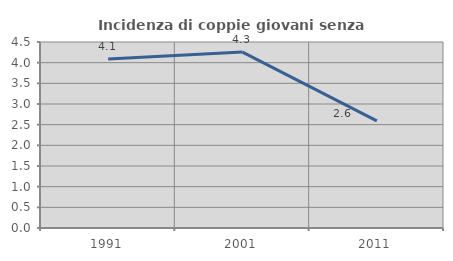
| Category | Incidenza di coppie giovani senza figli |
|---|---|
| 1991.0 | 4.091 |
| 2001.0 | 4.255 |
| 2011.0 | 2.59 |